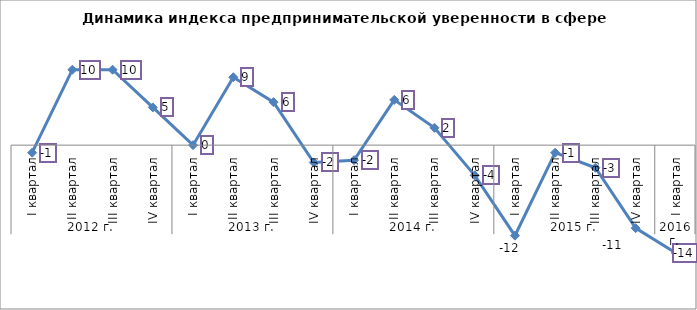
| Category | Series 0 |
|---|---|
| 0 | -1 |
| 1 | 10 |
| 2 | 10 |
| 3 | 5 |
| 4 | 0 |
| 5 | 9 |
| 6 | 5.7 |
| 7 | -2.3 |
| 8 | -2 |
| 9 | 6 |
| 10 | 2.3 |
| 11 | -4 |
| 12 | -12 |
| 13 | -1 |
| 14 | -3 |
| 15 | -11 |
| 16 | -14.3 |